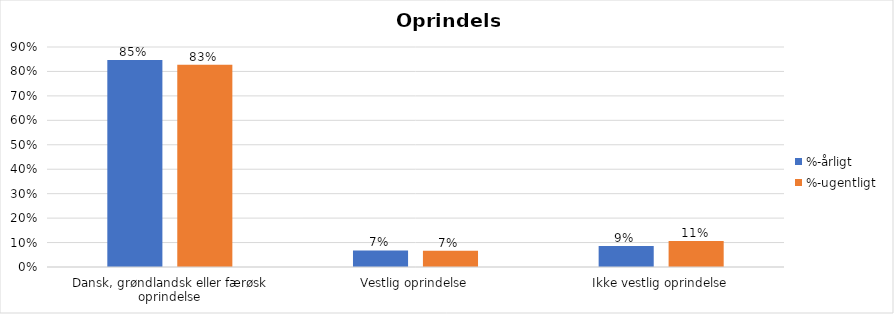
| Category | %-årligt | %-ugentligt |
|---|---|---|
| Dansk, grøndlandsk eller færøsk oprindelse | 0.847 | 0.827 |
| Vestlig oprindelse | 0.068 | 0.067 |
| Ikke vestlig oprindelse | 0.086 | 0.106 |